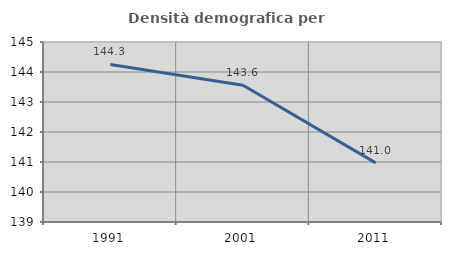
| Category | Densità demografica |
|---|---|
| 1991.0 | 144.253 |
| 2001.0 | 143.556 |
| 2011.0 | 140.97 |